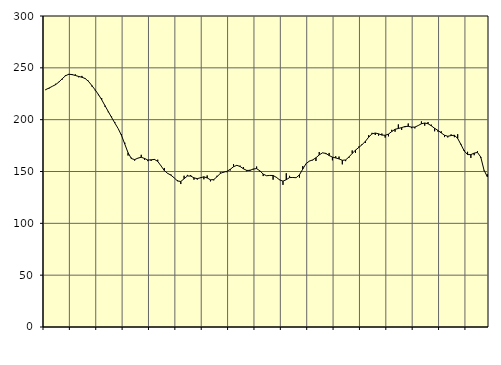
| Category | Piggar | Series 1 |
|---|---|---|
| nan | 228.5 | 228.99 |
| 87.0 | 229.9 | 230.46 |
| 87.0 | 232.1 | 232.12 |
| 87.0 | 234.6 | 233.77 |
| nan | 236.5 | 236.21 |
| 88.0 | 238.6 | 239.39 |
| 88.0 | 243 | 242.3 |
| 88.0 | 243.2 | 243.8 |
| nan | 243 | 243.53 |
| 89.0 | 243.7 | 242.62 |
| 89.0 | 240.9 | 241.7 |
| 89.0 | 242.2 | 240.94 |
| nan | 240.1 | 239.66 |
| 90.0 | 237.5 | 236.91 |
| 90.0 | 232.1 | 232.99 |
| 90.0 | 228.3 | 228.8 |
| nan | 223.6 | 224.38 |
| 91.0 | 220.8 | 219.25 |
| 91.0 | 212.5 | 213.54 |
| 91.0 | 207.2 | 207.82 |
| nan | 203 | 202.2 |
| 92.0 | 197.5 | 196.71 |
| 92.0 | 191.4 | 191.39 |
| 92.0 | 186.1 | 184.88 |
| nan | 177.8 | 176.49 |
| 93.0 | 165.4 | 168.1 |
| 93.0 | 163.3 | 162.52 |
| 93.0 | 160.5 | 161.46 |
| nan | 163 | 162.91 |
| 94.0 | 166.1 | 163.72 |
| 94.0 | 161.3 | 162.6 |
| 94.0 | 160 | 161.07 |
| nan | 160.2 | 161.27 |
| 95.0 | 161.1 | 161.66 |
| 95.0 | 161.4 | 159.78 |
| 95.0 | 155.3 | 155.4 |
| nan | 153.4 | 150.91 |
| 96.0 | 148 | 148.22 |
| 96.0 | 147.1 | 146.48 |
| 96.0 | 143.9 | 143.83 |
| nan | 141.6 | 140.88 |
| 97.0 | 137.9 | 140.37 |
| 97.0 | 145.9 | 142.99 |
| 97.0 | 146.7 | 145.66 |
| nan | 146.6 | 145.6 |
| 98.0 | 142.1 | 143.88 |
| 98.0 | 142.2 | 143.14 |
| 98.0 | 144.3 | 143.97 |
| nan | 142.5 | 144.91 |
| 99.0 | 146.2 | 143.79 |
| 99.0 | 140.5 | 141.96 |
| 99.0 | 141.5 | 142.19 |
| nan | 145.9 | 144.98 |
| 0.0 | 149.2 | 148.2 |
| 0.0 | 149 | 149.38 |
| 0.0 | 149.3 | 150.17 |
| nan | 151 | 152.11 |
| 1.0 | 157.1 | 154.62 |
| 1.0 | 155.6 | 155.96 |
| 1.0 | 155.6 | 154.81 |
| nan | 154.3 | 152.6 |
| 2.0 | 150.2 | 151.04 |
| 2.0 | 151.6 | 151.04 |
| 2.0 | 152 | 152.45 |
| nan | 154.8 | 152.76 |
| 3.0 | 150 | 150.59 |
| 3.0 | 145.6 | 147.49 |
| 3.0 | 145.8 | 145.92 |
| nan | 146.2 | 146.2 |
| 4.0 | 142.1 | 146.15 |
| 4.0 | 144.7 | 144.38 |
| 4.0 | 142.2 | 141.85 |
| nan | 137.1 | 140.7 |
| 5.0 | 148.3 | 142.08 |
| 5.0 | 145.8 | 144.14 |
| 5.0 | 144.3 | 144.23 |
| nan | 144 | 144.01 |
| 6.0 | 144.1 | 146.81 |
| 6.0 | 155.2 | 152.31 |
| 6.0 | 157.4 | 157.58 |
| nan | 160.2 | 160.02 |
| 7.0 | 160.8 | 161.16 |
| 7.0 | 160.1 | 163.24 |
| 7.0 | 168.8 | 166.01 |
| nan | 167.9 | 168 |
| 8.0 | 166.8 | 167.46 |
| 8.0 | 167.9 | 165.4 |
| 8.0 | 160.8 | 163.87 |
| nan | 164.7 | 163.08 |
| 9.0 | 164.4 | 162.14 |
| 9.0 | 156.9 | 160.8 |
| 9.0 | 160 | 161.14 |
| nan | 163.2 | 163.99 |
| 10.0 | 170.3 | 167.44 |
| 10.0 | 167.9 | 170.6 |
| 10.0 | 174.1 | 173.19 |
| nan | 176.5 | 175.88 |
| 11.0 | 177.5 | 179.09 |
| 11.0 | 185 | 183.1 |
| 11.0 | 187.3 | 186.33 |
| nan | 185.2 | 187.13 |
| 12.0 | 184.6 | 186.35 |
| 12.0 | 186.6 | 185.13 |
| 12.0 | 182.7 | 184.95 |
| nan | 183.9 | 186.07 |
| 13.0 | 190.2 | 188.54 |
| 13.0 | 188.4 | 190.72 |
| 13.0 | 195.4 | 191.48 |
| nan | 190.1 | 192.34 |
| 14.0 | 192.7 | 193.4 |
| 14.0 | 196.3 | 193.57 |
| 14.0 | 191.8 | 192.81 |
| nan | 191.6 | 192.81 |
| 15.0 | 194.3 | 194.31 |
| 15.0 | 198.3 | 196.04 |
| 15.0 | 194.2 | 196.79 |
| nan | 197.7 | 196.09 |
| 16.0 | 195.2 | 194.06 |
| 16.0 | 188.8 | 191.68 |
| 16.0 | 188.5 | 189.65 |
| nan | 188.8 | 187.24 |
| 17.0 | 183.2 | 184.94 |
| 17.0 | 182.9 | 184 |
| 17.0 | 185.8 | 184.66 |
| nan | 183.1 | 184.94 |
| 18.0 | 186 | 181.93 |
| 18.0 | 176.6 | 175.95 |
| 18.0 | 170.7 | 169.75 |
| nan | 169 | 166.31 |
| 19.0 | 163.1 | 166.28 |
| 19.0 | 165.7 | 167.75 |
| 19.0 | 169.6 | 168.4 |
| nan | 163.1 | 163.93 |
| 20.0 | 150.8 | 151.22 |
| 20.0 | 147.3 | 144.9 |